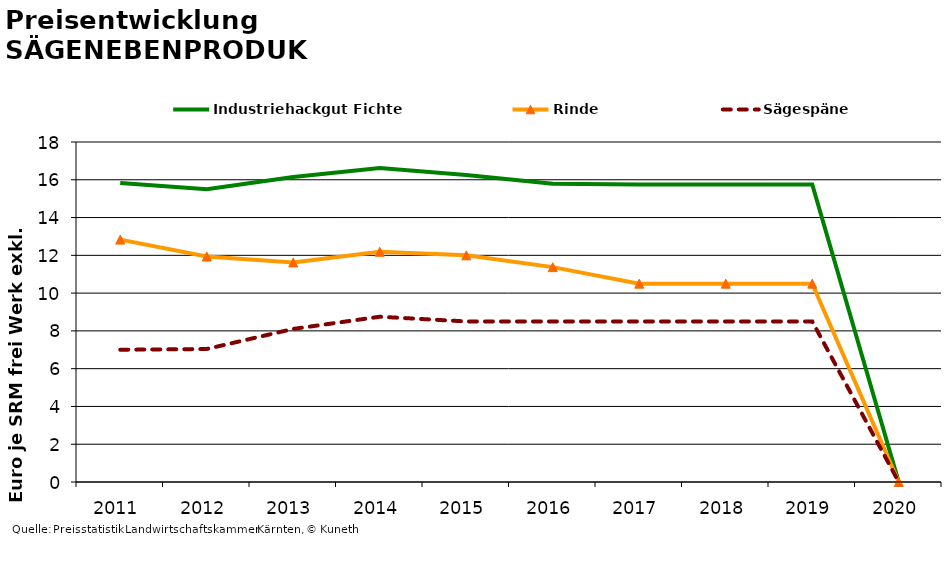
| Category | Industriehackgut Fichte | Rinde | Sägespäne |
|---|---|---|---|
| 2011.0 | 15.833 | 12.833 | 7 |
| 2012.0 | 15.5 | 11.938 | 7.042 |
| 2013.0 | 16.146 | 11.625 | 8.104 |
| 2014.0 | 16.625 | 12.188 | 8.75 |
| 2015.0 | 16.25 | 12 | 8.5 |
| 2016.0 | 15.792 | 11.375 | 8.5 |
| 2017.0 | 15.75 | 10.5 | 8.5 |
| 2018.0 | 15.75 | 10.5 | 8.5 |
| 2019.0 | 15.75 | 10.5 | 8.5 |
| 2020.0 | 0 | 0 | 0 |